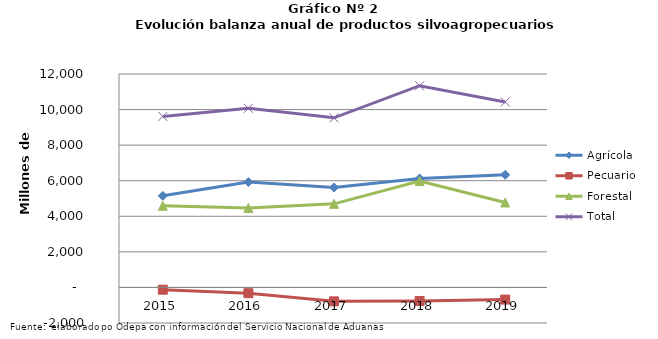
| Category | Agrícola | Pecuario | Forestal | Total |
|---|---|---|---|---|
| 2015.0 | 5149872 | -127785 | 4591408 | 9613495 |
| 2016.0 | 5924661 | -325421 | 4468104 | 10067344 |
| 2017.0 | 5619304 | -782654 | 4700192 | 9536842 |
| 2018.0 | 6126904 | -761998 | 5976134 | 11341040 |
| 2019.0 | 6332243 | -681837 | 4777162 | 10427568 |